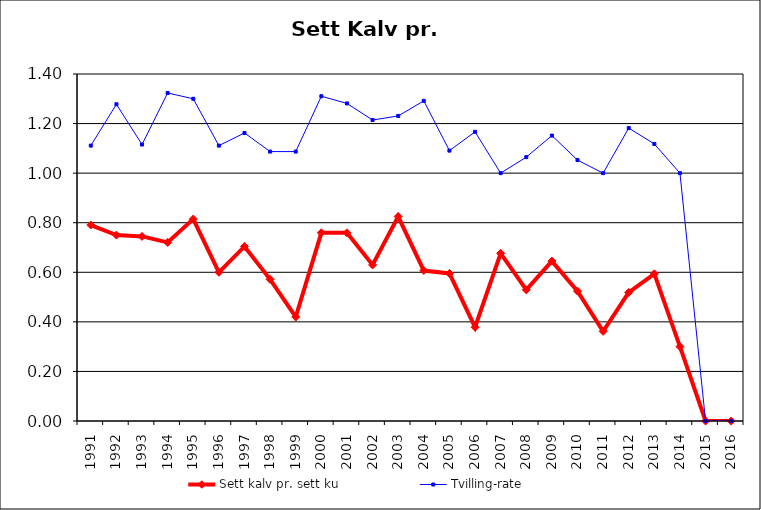
| Category | Sett kalv pr. sett ku | Tvilling-rate |
|---|---|---|
| 1991.0 | 0.791 | 1.111 |
| 1992.0 | 0.75 | 1.278 |
| 1993.0 | 0.745 | 1.115 |
| 1994.0 | 0.721 | 1.324 |
| 1995.0 | 0.815 | 1.3 |
| 1996.0 | 0.6 | 1.111 |
| 1997.0 | 0.704 | 1.162 |
| 1998.0 | 0.571 | 1.087 |
| 1999.0 | 0.42 | 1.087 |
| 2000.0 | 0.759 | 1.31 |
| 2001.0 | 0.759 | 1.281 |
| 2002.0 | 0.63 | 1.214 |
| 2003.0 | 0.825 | 1.231 |
| 2004.0 | 0.607 | 1.292 |
| 2005.0 | 0.595 | 1.091 |
| 2006.0 | 0.378 | 1.167 |
| 2007.0 | 0.676 | 1 |
| 2008.0 | 0.529 | 1.065 |
| 2009.0 | 0.645 | 1.152 |
| 2010.0 | 0.524 | 1.053 |
| 2011.0 | 0.362 | 1 |
| 2012.0 | 0.519 | 1.182 |
| 2013.0 | 0.594 | 1.118 |
| 2014.0 | 0.3 | 1 |
| 2015.0 | 0 | 0 |
| 2016.0 | 0 | 0 |